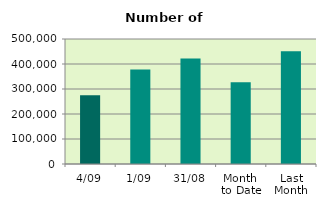
| Category | Series 0 |
|---|---|
| 4/09 | 274916 |
| 1/09 | 378162 |
| 31/08 | 422444 |
| Month 
to Date | 326539 |
| Last
Month | 451097.913 |